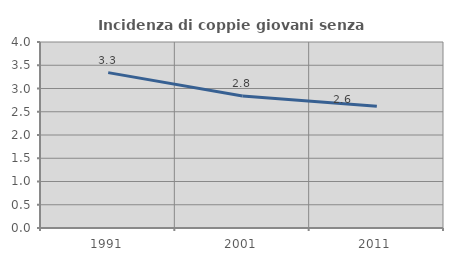
| Category | Incidenza di coppie giovani senza figli |
|---|---|
| 1991.0 | 3.342 |
| 2001.0 | 2.839 |
| 2011.0 | 2.619 |